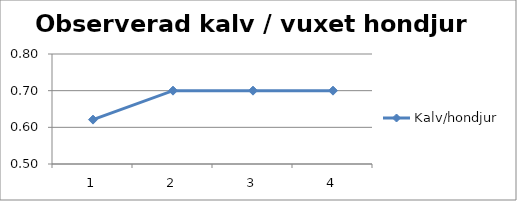
| Category | Kalv/hondjur |
|---|---|
| 0 | 0.621 |
| 1 | 0.7 |
| 2 | 0.7 |
| 3 | 0.7 |